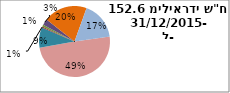
| Category | יתרה |
|---|---|
| נדל"ן ובינוי | 75.412 |
| תעשיה | 14.04 |
| שרותים פיננסיים | 0.776 |
| ביומד | 0.078 |
| חיפושי נפט וגז | 1.328 |
| טכנולוגיה | 4.25 |
| מסחר ושרותים | 30.394 |
| השקעה ואחזקות | 26.313 |